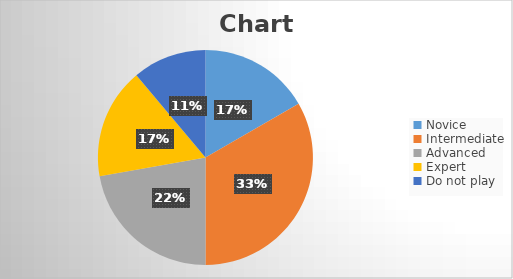
| Category | Series 0 |
|---|---|
| Novice | 3 |
| Intermediate | 6 |
| Advanced | 4 |
| Expert | 3 |
| Do not play | 2 |